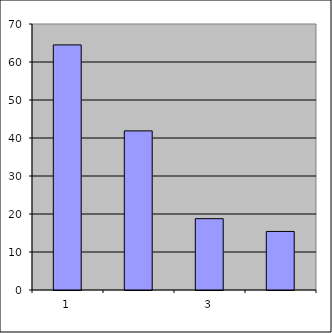
| Category | Series 0 |
|---|---|
| 0 | 64.5 |
| 1 | 41.869 |
| 2 | 18.767 |
| 3 | 15.411 |